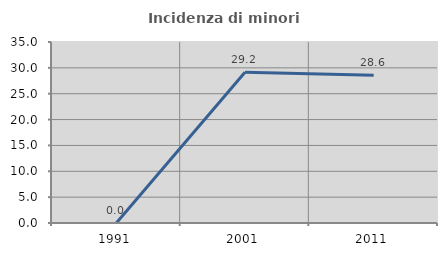
| Category | Incidenza di minori stranieri |
|---|---|
| 1991.0 | 0 |
| 2001.0 | 29.167 |
| 2011.0 | 28.571 |